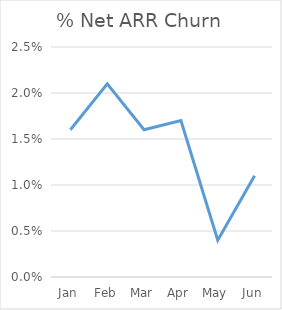
| Category | % Net ARR Churn |
|---|---|
| Jan | 0.016 |
| Feb | 0.021 |
| Mar | 0.016 |
| Apr | 0.017 |
| May | 0.004 |
| Jun | 0.011 |